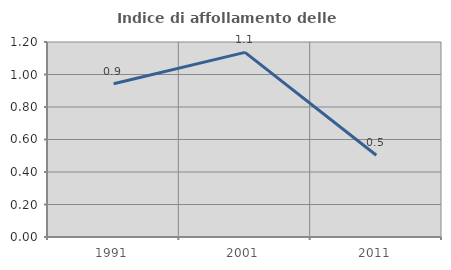
| Category | Indice di affollamento delle abitazioni  |
|---|---|
| 1991.0 | 0.943 |
| 2001.0 | 1.136 |
| 2011.0 | 0.503 |